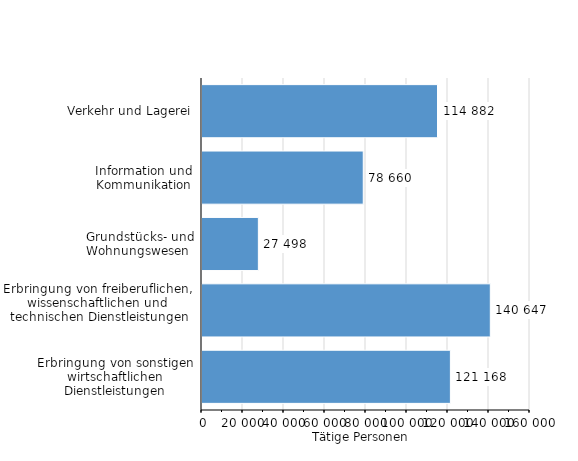
| Category | Tätige Personen |
|---|---|
| Verkehr und Lagerei | 114882 |
| Information und Kommunikation | 78660 |
| Grundstücks- und Wohnungswesen  | 27498 |
| Erbringung von freiberuflichen, 
wissenschaftlichen und 
technischen Dienstleistungen | 140647 |
| Erbringung von sonstigen wirtschaftlichen Dienstleistungen | 121168 |